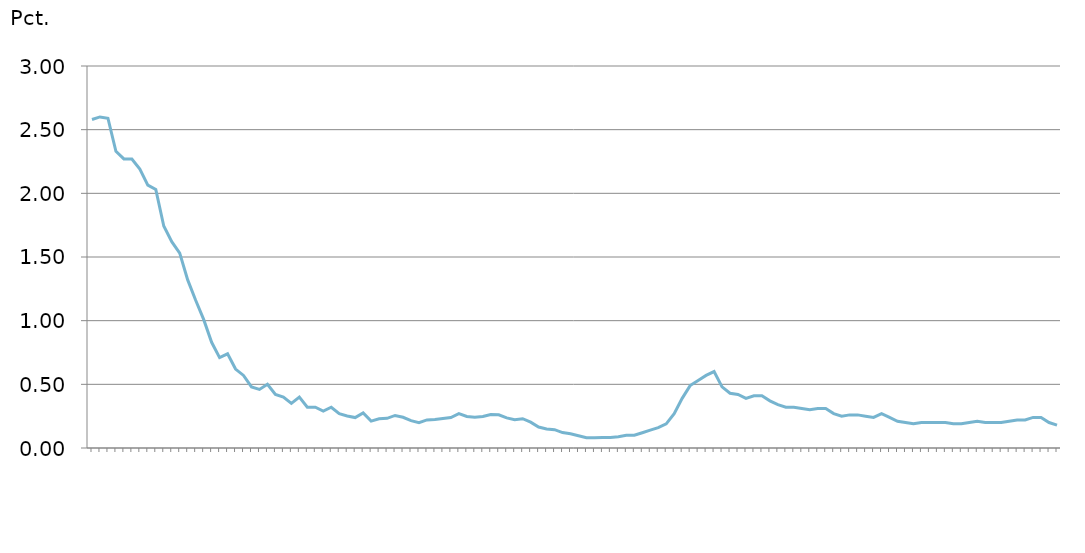
| Category | Restanceprocent |
|---|---|
| nan | 2.58 |
| nan | 2.6 |
| nan | 2.59 |
| 1991.0 | 2.33 |
| nan | 2.27 |
| nan | 2.27 |
| nan | 2.19 |
| 1992.0 | 2.064 |
| nan | 2.03 |
| nan | 1.743 |
| nan | 1.62 |
| 1993.0 | 1.53 |
| nan | 1.32 |
| nan | 1.16 |
| nan | 1.01 |
| 1994.0 | 0.83 |
| nan | 0.71 |
| nan | 0.74 |
| nan | 0.62 |
| 1995.0 | 0.57 |
| nan | 0.48 |
| nan | 0.46 |
| nan | 0.5 |
| 1996.0 | 0.42 |
| nan | 0.4 |
| nan | 0.35 |
| nan | 0.4 |
| 1997.0 | 0.32 |
| nan | 0.32 |
| nan | 0.29 |
| nan | 0.32 |
| 1998.0 | 0.269 |
| nan | 0.252 |
| nan | 0.239 |
| nan | 0.276 |
| 1999.0 | 0.211 |
| nan | 0.23 |
| nan | 0.233 |
| nan | 0.256 |
| 2000.0 | 0.241 |
| nan | 0.215 |
| nan | 0.199 |
| nan | 0.221 |
| 2001.0 | 0.224 |
| nan | 0.231 |
| nan | 0.239 |
| nan | 0.269 |
| 2002.0 | 0.247 |
| nan | 0.241 |
| nan | 0.248 |
| nan | 0.262 |
| 2003.0 | 0.261 |
| nan | 0.237 |
| nan | 0.223 |
| nan | 0.23 |
| 2004.0 | 0.203 |
| nan | 0.164 |
| nan | 0.149 |
| nan | 0.144 |
| 2005.0 | 0.121 |
| nan | 0.112 |
| nan | 0.097 |
| nan | 0.081 |
| 2006.0 | 0.08 |
| nan | 0.082 |
| nan | 0.082 |
| nan | 0.088 |
| 2007.0 | 0.1 |
| nan | 0.1 |
| nan | 0.12 |
| nan | 0.14 |
| 2008.0 | 0.16 |
| nan | 0.19 |
| nan | 0.27 |
| nan | 0.39 |
| 2009.0 | 0.49 |
| nan | 0.53 |
| nan | 0.57 |
| nan | 0.6 |
| 2010.0 | 0.48 |
| nan | 0.43 |
| nan | 0.42 |
| nan | 0.39 |
| 2011.0 | 0.41 |
| nan | 0.41 |
| nan | 0.37 |
| nan | 0.34 |
| 2012.0 | 0.32 |
| nan | 0.32 |
| nan | 0.31 |
| nan | 0.3 |
| 2013.0 | 0.31 |
| nan | 0.31 |
| nan | 0.27 |
| nan | 0.25 |
| 2014.0 | 0.26 |
| nan | 0.26 |
| nan | 0.25 |
| nan | 0.24 |
| 2015.0 | 0.27 |
| nan | 0.24 |
| nan | 0.21 |
| nan | 0.2 |
| 2016.0 | 0.19 |
| nan | 0.2 |
| nan | 0.2 |
| nan | 0.2 |
| 2017.0 | 0.2 |
| nan | 0.19 |
| nan | 0.19 |
| nan | 0.2 |
| 2018.0 | 0.21 |
| nan | 0.2 |
| nan | 0.2 |
| nan | 0.2 |
| 2019.0 | 0.21 |
| nan | 0.22 |
| nan | 0.22 |
| nan | 0.24 |
| 2020.0 | 0.24 |
| nan | 0.2 |
| nan | 0.18 |